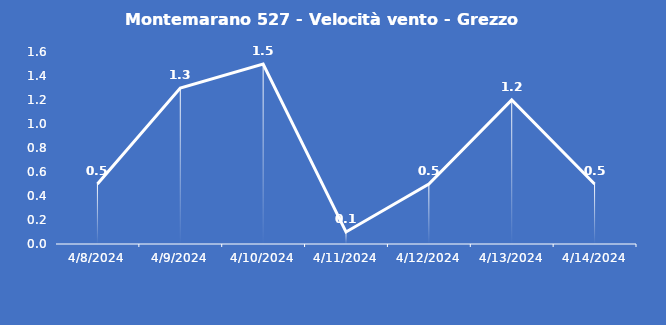
| Category | Montemarano 527 - Velocità vento - Grezzo (m/s) |
|---|---|
| 4/8/24 | 0.5 |
| 4/9/24 | 1.3 |
| 4/10/24 | 1.5 |
| 4/11/24 | 0.1 |
| 4/12/24 | 0.5 |
| 4/13/24 | 1.2 |
| 4/14/24 | 0.5 |